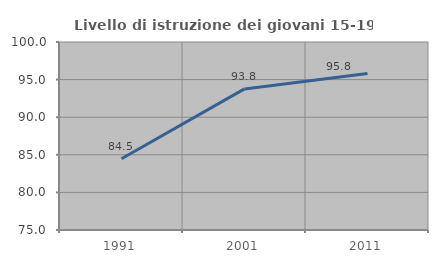
| Category | Livello di istruzione dei giovani 15-19 anni |
|---|---|
| 1991.0 | 84.479 |
| 2001.0 | 93.763 |
| 2011.0 | 95.802 |